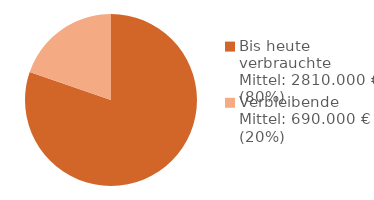
| Category | Series 0 |
|---|---|
| Bis heute verbrauchte Mittel: 2810.000 € (80%) | 2810 |
| Verbleibende Mittel: 690.000 € (20%) | 690 |